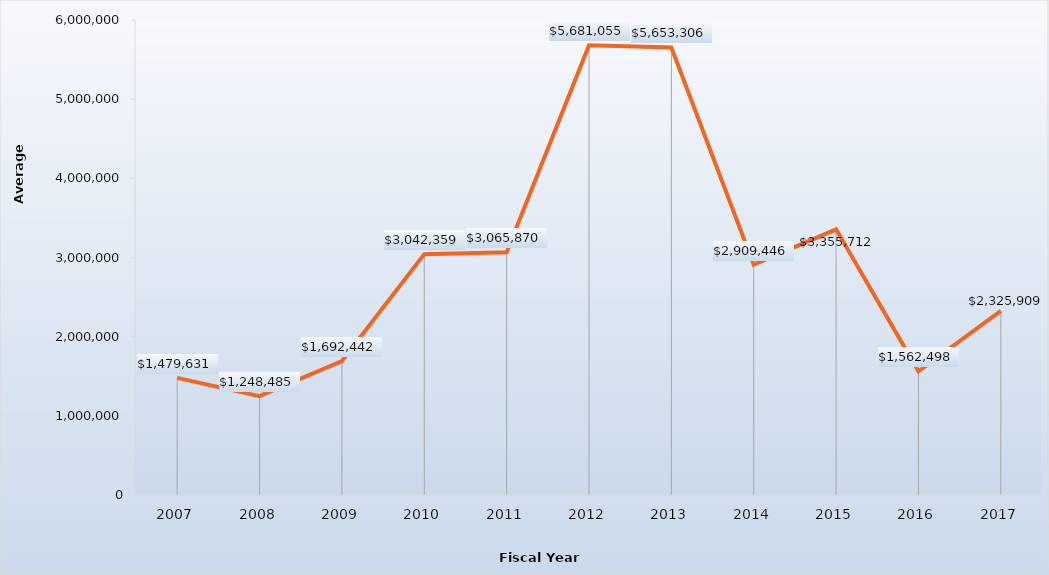
| Category | Mean |
|---|---|
| 2007.0 | 1479631 |
| 2008.0 | 1248485 |
| 2009.0 | 1692442 |
| 2010.0 | 3042359 |
| 2011.0 | 3065870 |
| 2012.0 | 5681055 |
| 2013.0 | 5653306 |
| 2014.0 | 2909446 |
| 2015.0 | 3355712 |
| 2016.0 | 1562498 |
| 2017.0 | 2325909 |